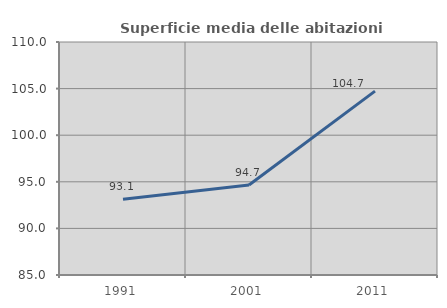
| Category | Superficie media delle abitazioni occupate |
|---|---|
| 1991.0 | 93.132 |
| 2001.0 | 94.65 |
| 2011.0 | 104.733 |